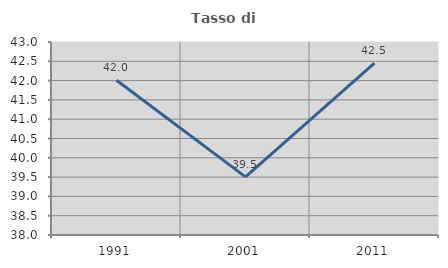
| Category | Tasso di occupazione   |
|---|---|
| 1991.0 | 42.007 |
| 2001.0 | 39.505 |
| 2011.0 | 42.455 |